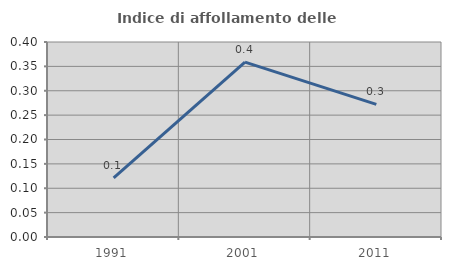
| Category | Indice di affollamento delle abitazioni  |
|---|---|
| 1991.0 | 0.121 |
| 2001.0 | 0.359 |
| 2011.0 | 0.272 |